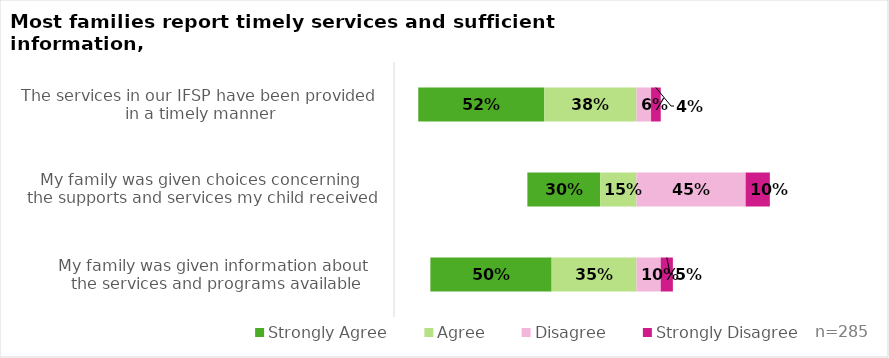
| Category | Buffer | Strongly Agree | Agree | Disagree | Strongly Disagree |
|---|---|---|---|---|---|
| My family was given information about 
the services and programs available | 0.85 | 0.5 | 0.35 | 0.1 | 0.05 |
| My family was given choices concerning 
the supports and services my child received | 0.45 | 0.3 | 0.15 | 0.45 | 0.1 |
| The services in our IFSP have been provided
 in a timely manner | 0.9 | 0.52 | 0.38 | 0.06 | 0.04 |